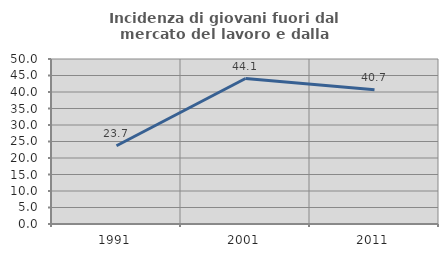
| Category | Incidenza di giovani fuori dal mercato del lavoro e dalla formazione  |
|---|---|
| 1991.0 | 23.704 |
| 2001.0 | 44.086 |
| 2011.0 | 40.678 |